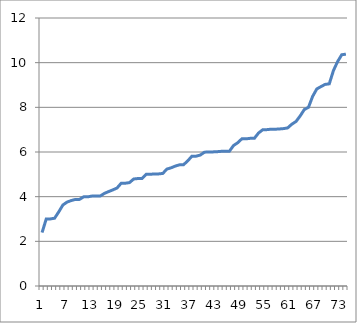
| Category | Series 0 |
|---|---|
| 0 | 2.393 |
| 1 | 3.004 |
| 2 | 3.004 |
| 3 | 3.034 |
| 4 | 3.318 |
| 5 | 3.627 |
| 6 | 3.757 |
| 7 | 3.826 |
| 8 | 3.876 |
| 9 | 3.879 |
| 10 | 3.995 |
| 11 | 3.995 |
| 12 | 4.028 |
| 13 | 4.033 |
| 14 | 4.033 |
| 15 | 4.149 |
| 16 | 4.229 |
| 17 | 4.304 |
| 18 | 4.387 |
| 19 | 4.599 |
| 20 | 4.602 |
| 21 | 4.629 |
| 22 | 4.79 |
| 23 | 4.812 |
| 24 | 4.812 |
| 25 | 4.999 |
| 26 | 5.002 |
| 27 | 5.019 |
| 28 | 5.019 |
| 29 | 5.041 |
| 30 | 5.237 |
| 31 | 5.292 |
| 32 | 5.369 |
| 33 | 5.425 |
| 34 | 5.433 |
| 35 | 5.604 |
| 36 | 5.814 |
| 37 | 5.814 |
| 38 | 5.861 |
| 39 | 5.99 |
| 40 | 6.004 |
| 41 | 6.004 |
| 42 | 6.013 |
| 43 | 6.029 |
| 44 | 6.032 |
| 45 | 6.032 |
| 46 | 6.291 |
| 47 | 6.416 |
| 48 | 6.59 |
| 49 | 6.59 |
| 50 | 6.612 |
| 51 | 6.612 |
| 52 | 6.849 |
| 53 | 6.995 |
| 54 | 7.001 |
| 55 | 7.02 |
| 56 | 7.02 |
| 57 | 7.031 |
| 58 | 7.048 |
| 59 | 7.078 |
| 60 | 7.244 |
| 61 | 7.365 |
| 62 | 7.611 |
| 63 | 7.901 |
| 64 | 8 |
| 65 | 8.489 |
| 66 | 8.823 |
| 67 | 8.928 |
| 68 | 9.027 |
| 69 | 9.052 |
| 70 | 9.645 |
| 71 | 10.049 |
| 72 | 10.355 |
| 73 | 10.38 |